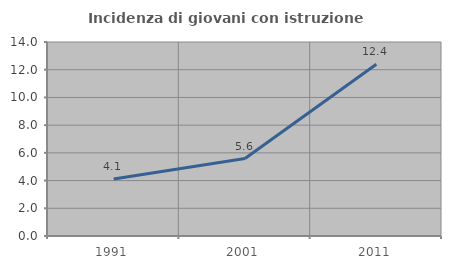
| Category | Incidenza di giovani con istruzione universitaria |
|---|---|
| 1991.0 | 4.11 |
| 2001.0 | 5.59 |
| 2011.0 | 12.389 |